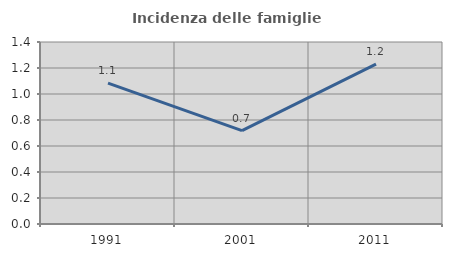
| Category | Incidenza delle famiglie numerose |
|---|---|
| 1991.0 | 1.083 |
| 2001.0 | 0.718 |
| 2011.0 | 1.23 |